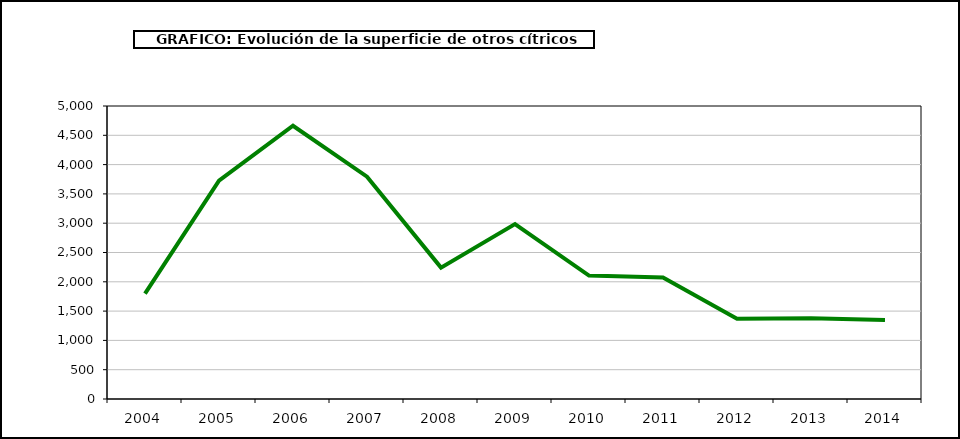
| Category | superficie |
|---|---|
| 2004.0 | 1797 |
| 2005.0 | 3726 |
| 2006.0 | 4663 |
| 2007.0 | 3794 |
| 2008.0 | 2242 |
| 2009.0 | 2984 |
| 2010.0 | 2106 |
| 2011.0 | 2074 |
| 2012.0 | 1368 |
| 2013.0 | 1377 |
| 2014.0 | 1349 |